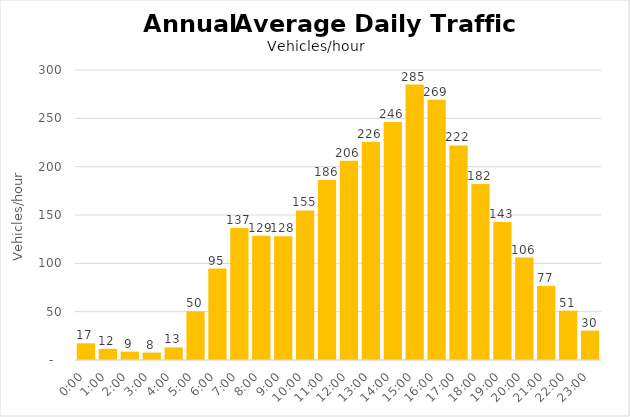
| Category | Volume |
|---|---|
| 0.0 | 17.294 |
| 0.041666666666666664 | 11.544 |
| 0.0833333333333333 | 8.617 |
| 0.125 | 7.611 |
| 0.166666666666667 | 13.017 |
| 0.208333333333333 | 50.35 |
| 0.25 | 94.557 |
| 0.291666666666667 | 136.584 |
| 0.333333333333333 | 128.647 |
| 0.375 | 127.968 |
| 0.416666666666667 | 154.761 |
| 0.458333333333333 | 186.2 |
| 0.5 | 206.159 |
| 0.541666666666667 | 225.614 |
| 0.583333333333333 | 246.195 |
| 0.625 | 284.998 |
| 0.666666666666667 | 269.215 |
| 0.708333333333333 | 222.011 |
| 0.75 | 182.131 |
| 0.791666666666667 | 142.716 |
| 0.833333333333333 | 105.942 |
| 0.875 | 76.587 |
| 0.916666666666667 | 51.098 |
| 0.958333333333333 | 30.375 |